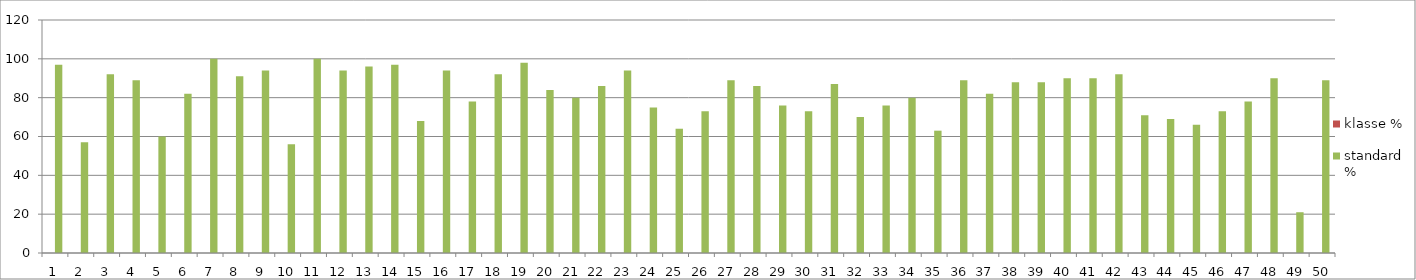
| Category | klasse % | standard % |
|---|---|---|
| 1.0 | 0 | 97 |
| 2.0 | 0 | 57 |
| 3.0 | 0 | 92 |
| 4.0 | 0 | 89 |
| 5.0 | 0 | 60 |
| 6.0 | 0 | 82 |
| 7.0 | 0 | 100 |
| 8.0 | 0 | 91 |
| 9.0 | 0 | 94 |
| 10.0 | 0 | 56 |
| 11.0 | 0 | 100 |
| 12.0 | 0 | 94 |
| 13.0 | 0 | 96 |
| 14.0 | 0 | 97 |
| 15.0 | 0 | 68 |
| 16.0 | 0 | 94 |
| 17.0 | 0 | 78 |
| 18.0 | 0 | 92 |
| 19.0 | 0 | 98 |
| 20.0 | 0 | 84 |
| 21.0 | 0 | 80 |
| 22.0 | 0 | 86 |
| 23.0 | 0 | 94 |
| 24.0 | 0 | 75 |
| 25.0 | 0 | 64 |
| 26.0 | 0 | 73 |
| 27.0 | 0 | 89 |
| 28.0 | 0 | 86 |
| 29.0 | 0 | 76 |
| 30.0 | 0 | 73 |
| 31.0 | 0 | 87 |
| 32.0 | 0 | 70 |
| 33.0 | 0 | 76 |
| 34.0 | 0 | 80 |
| 35.0 | 0 | 63 |
| 36.0 | 0 | 89 |
| 37.0 | 0 | 82 |
| 38.0 | 0 | 88 |
| 39.0 | 0 | 88 |
| 40.0 | 0 | 90 |
| 41.0 | 0 | 90 |
| 42.0 | 0 | 92 |
| 43.0 | 0 | 71 |
| 44.0 | 0 | 69 |
| 45.0 | 0 | 66 |
| 46.0 | 0 | 73 |
| 47.0 | 0 | 78 |
| 48.0 | 0 | 90 |
| 49.0 | 0 | 21 |
| 50.0 | 0 | 89 |